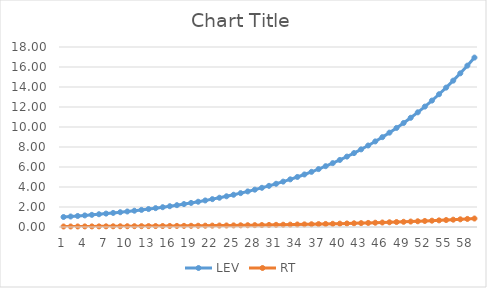
| Category | LEV | RT |
|---|---|---|
| 0 | 1 | 0.05 |
| 1 | 1.05 | 0.053 |
| 2 | 1.102 | 0.055 |
| 3 | 1.158 | 0.058 |
| 4 | 1.216 | 0.061 |
| 5 | 1.276 | 0.064 |
| 6 | 1.34 | 0.067 |
| 7 | 1.407 | 0.07 |
| 8 | 1.477 | 0.074 |
| 9 | 1.551 | 0.078 |
| 10 | 1.629 | 0.081 |
| 11 | 1.71 | 0.086 |
| 12 | 1.796 | 0.09 |
| 13 | 1.886 | 0.094 |
| 14 | 1.98 | 0.099 |
| 15 | 2.079 | 0.104 |
| 16 | 2.183 | 0.109 |
| 17 | 2.292 | 0.115 |
| 18 | 2.407 | 0.12 |
| 19 | 2.527 | 0.126 |
| 20 | 2.653 | 0.133 |
| 21 | 2.786 | 0.139 |
| 22 | 2.925 | 0.146 |
| 23 | 3.072 | 0.154 |
| 24 | 3.225 | 0.161 |
| 25 | 3.386 | 0.169 |
| 26 | 3.556 | 0.178 |
| 27 | 3.733 | 0.187 |
| 28 | 3.92 | 0.196 |
| 29 | 4.116 | 0.206 |
| 30 | 4.322 | 0.216 |
| 31 | 4.538 | 0.227 |
| 32 | 4.765 | 0.238 |
| 33 | 5.003 | 0.25 |
| 34 | 5.253 | 0.263 |
| 35 | 5.516 | 0.276 |
| 36 | 5.792 | 0.29 |
| 37 | 6.081 | 0.304 |
| 38 | 6.385 | 0.319 |
| 39 | 6.705 | 0.335 |
| 40 | 7.04 | 0.352 |
| 41 | 7.392 | 0.37 |
| 42 | 7.762 | 0.388 |
| 43 | 8.15 | 0.407 |
| 44 | 8.557 | 0.428 |
| 45 | 8.985 | 0.449 |
| 46 | 9.434 | 0.472 |
| 47 | 9.906 | 0.495 |
| 48 | 10.401 | 0.52 |
| 49 | 10.921 | 0.546 |
| 50 | 11.467 | 0.573 |
| 51 | 12.041 | 0.602 |
| 52 | 12.643 | 0.632 |
| 53 | 13.275 | 0.664 |
| 54 | 13.939 | 0.697 |
| 55 | 14.636 | 0.732 |
| 56 | 15.367 | 0.768 |
| 57 | 16.136 | 0.807 |
| 58 | 16.943 | 0.847 |